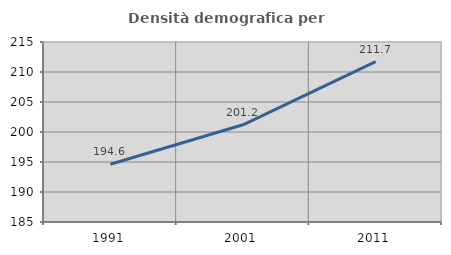
| Category | Densità demografica |
|---|---|
| 1991.0 | 194.623 |
| 2001.0 | 201.203 |
| 2011.0 | 211.72 |